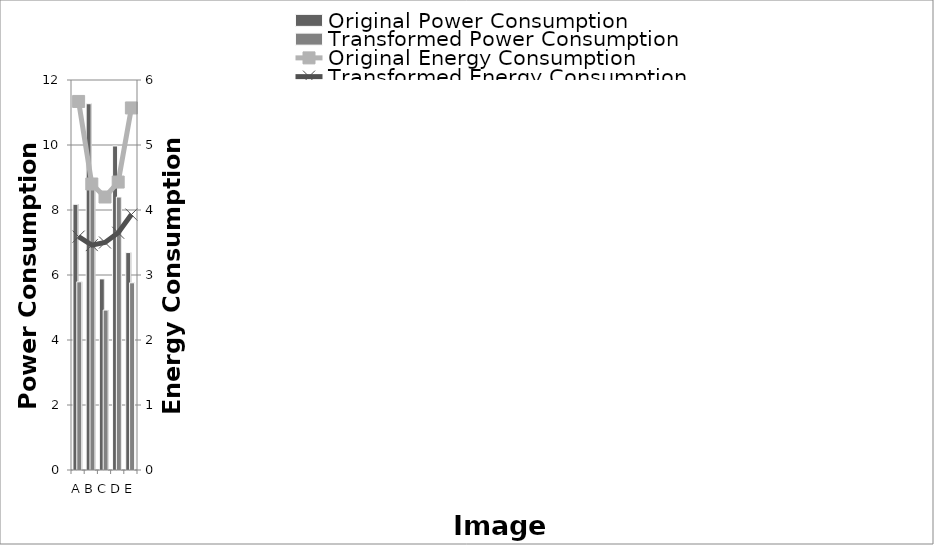
| Category | Original Power Consumption | Transformed Power Consumption |
|---|---|---|
| A | 8.175 | 5.79 |
| B | 11.27 | 8.81 |
| C | 5.88 | 4.92 |
| D | 9.97 | 8.4 |
| E | 6.69 | 5.76 |